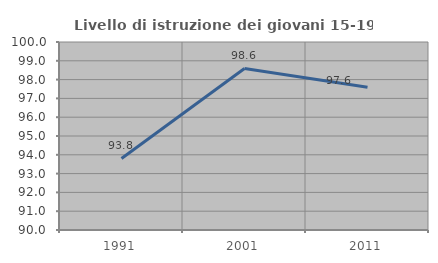
| Category | Livello di istruzione dei giovani 15-19 anni |
|---|---|
| 1991.0 | 93.805 |
| 2001.0 | 98.592 |
| 2011.0 | 97.59 |